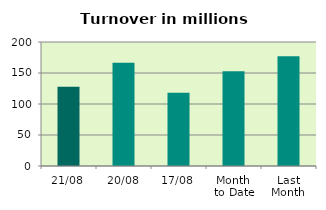
| Category | Series 0 |
|---|---|
| 21/08 | 127.737 |
| 20/08 | 166.499 |
| 17/08 | 118.182 |
| Month 
to Date | 152.649 |
| Last
Month | 177.022 |